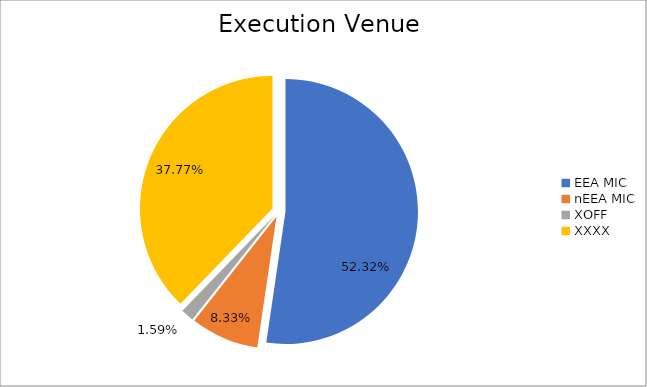
| Category | Series 0 |
|---|---|
| EEA MIC | 6920927.383 |
| nEEA MIC | 1101905.793 |
| XOFF | 209961.137 |
| XXXX | 4996400.743 |